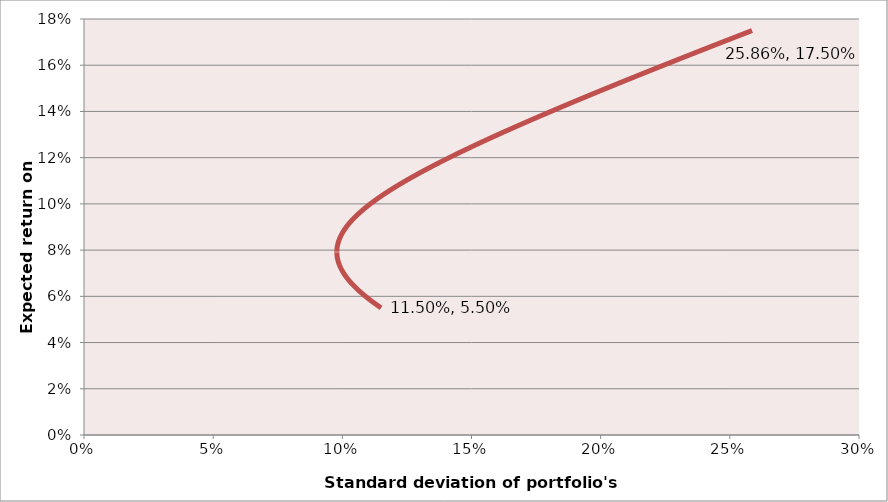
| Category | Ret(p) |
|---|---|
| 0.115 | 0.055 |
| 0.11484289846794242 | 0.055 |
| 0.11468636516202031 | 0.055 |
| 0.11453040241208622 | 0.055 |
| 0.11437501255218531 | 0.055 |
| 0.11422019792046717 | 0.056 |
| 0.1140659608590961 | 0.056 |
| 0.11391230371415985 | 0.056 |
| 0.11375922883557692 | 0.056 |
| 0.11360673857700218 | 0.056 |
| 0.11345483529573114 | 0.056 |
| 0.1133035213526025 | 0.056 |
| 0.11315279911189922 | 0.056 |
| 0.11300267094124809 | 0.057 |
| 0.11285313921151761 | 0.057 |
| 0.11270420629671442 | 0.057 |
| 0.11255587457387796 | 0.057 |
| 0.11240814642297389 | 0.057 |
| 0.11226102422678555 | 0.057 |
| 0.11211451037080405 | 0.057 |
| 0.11196860724311673 | 0.057 |
| 0.11182331723429394 | 0.058 |
| 0.11167864273727429 | 0.058 |
| 0.11153458614724834 | 0.058 |
| 0.11139114986154051 | 0.058 |
| 0.11124833627948959 | 0.058 |
| 0.11110614780232742 | 0.058 |
| 0.11096458683305613 | 0.058 |
| 0.11082365577632369 | 0.058 |
| 0.11068335703829786 | 0.058 |
| 0.11054369302653842 | 0.059 |
| 0.11040466614986798 | 0.059 |
| 0.11026627881824093 | 0.059 |
| 0.11012853344261105 | 0.059 |
| 0.1099914324347972 | 0.059 |
| 0.10985497820734759 | 0.059 |
| 0.10971917317340245 | 0.059 |
| 0.10958401974655493 | 0.059 |
| 0.10944952034071055 | 0.06 |
| 0.10931567736994491 | 0.06 |
| 0.10918249324835992 | 0.06 |
| 0.10904997038993841 | 0.06 |
| 0.10891811120839695 | 0.06 |
| 0.10878691811703747 | 0.06 |
| 0.10865639352859686 | 0.06 |
| 0.10852653985509536 | 0.06 |
| 0.10839735950768313 | 0.061 |
| 0.10826885489648537 | 0.061 |
| 0.10814102843044592 | 0.061 |
| 0.10801388251716916 | 0.061 |
| 0.1078874195627606 | 0.061 |
| 0.10776164197166566 | 0.061 |
| 0.10763655214650726 | 0.061 |
| 0.10751215248792158 | 0.061 |
| 0.10738844539439256 | 0.061 |
| 0.10726543326208479 | 0.062 |
| 0.10714311848467499 | 0.062 |
| 0.107021503453182 | 0.062 |
| 0.10690059055579527 | 0.062 |
| 0.10678038217770218 | 0.062 |
| 0.10666088070091342 | 0.062 |
| 0.10654208850408764 | 0.062 |
| 0.10642400796235406 | 0.062 |
| 0.10630664144713428 | 0.063 |
| 0.10618999132596221 | 0.063 |
| 0.10607405996230325 | 0.063 |
| 0.10595884971537146 | 0.063 |
| 0.10584436293994619 | 0.063 |
| 0.10573060198618674 | 0.063 |
| 0.10561756919944629 | 0.063 |
| 0.10550526692008419 | 0.063 |
| 0.10539369748327745 | 0.064 |
| 0.10528286321883064 | 0.064 |
| 0.10517276645098485 | 0.064 |
| 0.10506340949822543 | 0.064 |
| 0.10495479467308873 | 0.064 |
| 0.1048469242819675 | 0.064 |
| 0.10473980062491546 | 0.064 |
| 0.10463342599545071 | 0.064 |
| 0.10452780268035813 | 0.064 |
| 0.1044229329594908 | 0.065 |
| 0.1043188191055705 | 0.065 |
| 0.1042154633839872 | 0.065 |
| 0.10411286805259767 | 0.065 |
| 0.10401103536152331 | 0.065 |
| 0.10390996755294701 | 0.065 |
| 0.1038096668609092 | 0.065 |
| 0.10371013551110327 | 0.065 |
| 0.10361137572067007 | 0.066 |
| 0.10351338969799181 | 0.066 |
| 0.10341617964248527 | 0.066 |
| 0.1033197477443942 | 0.066 |
| 0.10322409618458146 | 0.066 |
| 0.10312922713432017 | 0.066 |
| 0.10303514275508466 | 0.066 |
| 0.10294184519834079 | 0.066 |
| 0.1028493366053357 | 0.067 |
| 0.10275761910688733 | 0.067 |
| 0.10266669482317345 | 0.067 |
| 0.10257656586352035 | 0.067 |
| 0.10248723432619124 | 0.067 |
| 0.10239870229817434 | 0.067 |
| 0.10231097185497087 | 0.067 |
| 0.10222404506038273 | 0.067 |
| 0.10213792396629996 | 0.067 |
| 0.10205261061248845 | 0.068 |
| 0.10196810702637721 | 0.068 |
| 0.10188441522284576 | 0.068 |
| 0.10180153720401168 | 0.068 |
| 0.1017194749590181 | 0.068 |
| 0.10163823046382128 | 0.068 |
| 0.10155780568097852 | 0.068 |
| 0.10147820255943607 | 0.068 |
| 0.10139942303431755 | 0.069 |
| 0.10132146902671242 | 0.069 |
| 0.10124434244346496 | 0.069 |
| 0.10116804517696366 | 0.069 |
| 0.10109257910493097 | 0.069 |
| 0.10101794609021357 | 0.069 |
| 0.10094414798057323 | 0.069 |
| 0.10087118660847827 | 0.069 |
| 0.10079906379089552 | 0.07 |
| 0.10072778132908324 | 0.07 |
| 0.10065734100838446 | 0.07 |
| 0.10058774459802142 | 0.07 |
| 0.10051899385089061 | 0.07 |
| 0.10045109050335879 | 0.07 |
| 0.1003840362750601 | 0.07 |
| 0.10031783286869383 | 0.07 |
| 0.10025248196982357 | 0.07 |
| 0.10018798524667723 | 0.071 |
| 0.10012434434994834 | 0.071 |
| 0.10006156091259845 | 0.071 |
| 0.0999996365496609 | 0.071 |
| 0.09993857285804568 | 0.071 |
| 0.0998783714163459 | 0.071 |
| 0.09981903378464538 | 0.071 |
| 0.09976056150432802 | 0.071 |
| 0.09970295609788836 | 0.072 |
| 0.09964621906874392 | 0.072 |
| 0.09959035190104891 | 0.072 |
| 0.09953535605950989 | 0.072 |
| 0.09948123298920289 | 0.072 |
| 0.09942798411539244 | 0.072 |
| 0.0993756108433523 | 0.072 |
| 0.09932411455818807 | 0.072 |
| 0.09927349662466183 | 0.073 |
| 0.09922375838701847 | 0.073 |
| 0.09917490116881439 | 0.073 |
| 0.09912692627274783 | 0.073 |
| 0.09907983498049173 | 0.073 |
| 0.09903362855252838 | 0.073 |
| 0.09898830822798652 | 0.073 |
| 0.09894387522448048 | 0.073 |
| 0.09890033073795186 | 0.073 |
| 0.0988576759425133 | 0.074 |
| 0.09881591199029478 | 0.074 |
| 0.09877504001129232 | 0.074 |
| 0.09873506111321913 | 0.074 |
| 0.09869597638135934 | 0.074 |
| 0.09865778687842418 | 0.074 |
| 0.09862049364441092 | 0.074 |
| 0.09858409769646435 | 0.074 |
| 0.09854860002874098 | 0.075 |
| 0.09851400161227594 | 0.075 |
| 0.09848030339485278 | 0.075 |
| 0.09844750630087588 | 0.075 |
| 0.098415611231246 | 0.075 |
| 0.09838461906323827 | 0.075 |
| 0.0983545306503837 | 0.075 |
| 0.09832534682235314 | 0.075 |
| 0.0982970683848445 | 0.076 |
| 0.098269696119473 | 0.076 |
| 0.09824323078366438 | 0.076 |
| 0.09821767311055137 | 0.076 |
| 0.09819302380887301 | 0.076 |
| 0.09816928356287771 | 0.076 |
| 0.09814645303222873 | 0.076 |
| 0.09812453285191361 | 0.076 |
| 0.0981035236321564 | 0.076 |
| 0.0980834259583334 | 0.077 |
| 0.09806424039089211 | 0.077 |
| 0.09804596746527358 | 0.077 |
| 0.09802860769183808 | 0.077 |
| 0.09801216155579426 | 0.077 |
| 0.09799662951713152 | 0.077 |
| 0.09798201201055608 | 0.077 |
| 0.09796830944543027 | 0.077 |
| 0.09795552220571545 | 0.078 |
| 0.09794365064991832 | 0.078 |
| 0.09793269511104086 | 0.078 |
| 0.0979226558965336 | 0.078 |
| 0.09791353328825272 | 0.078 |
| 0.09790532754242039 | 0.078 |
| 0.09789803888958898 | 0.078 |
| 0.09789166753460854 | 0.078 |
| 0.09788621365659822 | 0.079 |
| 0.0978816774089209 | 0.079 |
| 0.09787805891916189 | 0.079 |
| 0.09787535828911073 | 0.079 |
| 0.0978735755947471 | 0.079 |
| 0.09787271088622994 | 0.079 |
| 0.09787276418789059 | 0.079 |
| 0.09787373549822916 | 0.079 |
| 0.09787562478991495 | 0.079 |
| 0.09787843200979013 | 0.08 |
| 0.09788215707887729 | 0.08 |
| 0.09788679989239055 | 0.08 |
| 0.09789236031975025 | 0.08 |
| 0.09789883820460141 | 0.08 |
| 0.09790623336483553 | 0.08 |
| 0.09791454559261638 | 0.08 |
| 0.09792377465440899 | 0.08 |
| 0.09793392029101254 | 0.081 |
| 0.09794498221759665 | 0.081 |
| 0.09795696012374136 | 0.081 |
| 0.09796985367348057 | 0.081 |
| 0.09798366250534898 | 0.081 |
| 0.0979983862324328 | 0.081 |
| 0.09801402444242366 | 0.081 |
| 0.09803057669767617 | 0.081 |
| 0.09804804253526905 | 0.082 |
| 0.09806642146706937 | 0.082 |
| 0.09808571297980072 | 0.082 |
| 0.09810591653511429 | 0.082 |
| 0.09812703156966372 | 0.082 |
| 0.09814905749518309 | 0.082 |
| 0.09817199369856829 | 0.082 |
| 0.09819583954196183 | 0.082 |
| 0.0982205943628407 | 0.082 |
| 0.0982462574741078 | 0.083 |
| 0.09827282816418623 | 0.083 |
| 0.09830030569711709 | 0.083 |
| 0.09832868931266027 | 0.083 |
| 0.09835797822639845 | 0.083 |
| 0.0983881716298442 | 0.083 |
| 0.09841926869055007 | 0.083 |
| 0.09845126855222182 | 0.083 |
| 0.09848417033483463 | 0.084 |
| 0.09851797313475212 | 0.084 |
| 0.0985526760248486 | 0.084 |
| 0.09858827805463384 | 0.084 |
| 0.09862477825038102 | 0.084 |
| 0.09866217561525727 | 0.084 |
| 0.09870046912945706 | 0.084 |
| 0.09873965775033833 | 0.084 |
| 0.09877974041256131 | 0.085 |
| 0.09882071602822988 | 0.085 |
| 0.0988625834870357 | 0.085 |
| 0.0989053416564048 | 0.085 |
| 0.09894898938164667 | 0.085 |
| 0.09899352548610588 | 0.085 |
| 0.09903894877131605 | 0.085 |
| 0.0990852580171563 | 0.085 |
| 0.09913245198200998 | 0.085 |
| 0.09918052940292563 | 0.086 |
| 0.0992294889957803 | 0.086 |
| 0.09927932945544492 | 0.086 |
| 0.09933004945595196 | 0.086 |
| 0.09938164765066515 | 0.086 |
| 0.09943412267245114 | 0.086 |
| 0.09948747313385321 | 0.086 |
| 0.0995416976272671 | 0.086 |
| 0.09959679472511845 | 0.087 |
| 0.09965276298004233 | 0.087 |
| 0.09970960092506446 | 0.087 |
| 0.09976730707378414 | 0.087 |
| 0.099825879920559 | 0.087 |
| 0.09988531794069135 | 0.087 |
| 0.09994561959061601 | 0.087 |
| 0.10000678330809 | 0.087 |
| 0.10006880751238324 | 0.088 |
| 0.10013169060447125 | 0.088 |
| 0.10019543096722874 | 0.088 |
| 0.10026002696562501 | 0.088 |
| 0.10032547694692016 | 0.088 |
| 0.10039177924086301 | 0.088 |
| 0.10045893215988977 | 0.088 |
| 0.1005269339993243 | 0.088 |
| 0.10059578303757905 | 0.088 |
| 0.10066547753635727 | 0.089 |
| 0.1007360157408562 | 0.089 |
| 0.10080739587997108 | 0.089 |
| 0.10087961616650014 | 0.089 |
| 0.10095267479735039 | 0.089 |
| 0.10102656995374425 | 0.089 |
| 0.10110129980142675 | 0.089 |
| 0.10117686249087375 | 0.089 |
| 0.10125325615750035 | 0.09 |
| 0.10133047892187026 | 0.09 |
| 0.10140852888990552 | 0.09 |
| 0.10148740415309686 | 0.09 |
| 0.10156710278871421 | 0.09 |
| 0.10164762286001806 | 0.09 |
| 0.1017289624164706 | 0.09 |
| 0.10181111949394783 | 0.09 |
| 0.10189409211495118 | 0.091 |
| 0.10197787828882006 | 0.091 |
| 0.10206247601194396 | 0.091 |
| 0.10214788326797518 | 0.091 |
| 0.10223409802804118 | 0.091 |
| 0.1023211182509573 | 0.091 |
| 0.10240894188343928 | 0.091 |
| 0.10249756686031579 | 0.091 |
| 0.1025869911047408 | 0.091 |
| 0.10267721252840593 | 0.092 |
| 0.10276822903175237 | 0.092 |
| 0.10286003850418289 | 0.092 |
| 0.1029526388242733 | 0.092 |
| 0.10304602785998376 | 0.092 |
| 0.10314020346886967 | 0.092 |
| 0.10323516349829223 | 0.092 |
| 0.10333090578562844 | 0.092 |
| 0.10342742815848087 | 0.093 |
| 0.10352472843488662 | 0.093 |
| 0.10362280442352605 | 0.093 |
| 0.10372165392393065 | 0.093 |
| 0.10382127472669055 | 0.093 |
| 0.10392166461366113 | 0.093 |
| 0.10402282135816925 | 0.093 |
| 0.10412474272521836 | 0.093 |
| 0.10422742647169336 | 0.094 |
| 0.10433087034656414 | 0.094 |
| 0.10443507209108878 | 0.094 |
| 0.10454002943901561 | 0.094 |
| 0.10464574011678447 | 0.094 |
| 0.10475220184372709 | 0.094 |
| 0.10485941233226655 | 0.094 |
| 0.10496736928811566 | 0.094 |
| 0.10507607041047456 | 0.094 |
| 0.10518551339222701 | 0.095 |
| 0.10529569592013595 | 0.095 |
| 0.10540661567503769 | 0.095 |
| 0.10551827033203529 | 0.095 |
| 0.10563065756069047 | 0.095 |
| 0.10574377502521477 | 0.095 |
| 0.10585762038465922 | 0.095 |
| 0.10597219129310297 | 0.095 |
| 0.10608748539984063 | 0.096 |
| 0.10620350034956849 | 0.096 |
| 0.1063202337825693 | 0.096 |
| 0.106437683334896 | 0.096 |
| 0.10655584663855382 | 0.096 |
| 0.10667472132168153 | 0.096 |
| 0.10679430500873081 | 0.096 |
| 0.10691459532064482 | 0.096 |
| 0.10703558987503488 | 0.097 |
| 0.10715728628635617 | 0.097 |
| 0.10727968216608177 | 0.097 |
| 0.10740277512287547 | 0.097 |
| 0.10752656276276293 | 0.097 |
| 0.10765104268930159 | 0.097 |
| 0.10777621250374907 | 0.097 |
| 0.10790206980523 | 0.097 |
| 0.10802861219090143 | 0.097 |
| 0.10815583725611687 | 0.098 |
| 0.10828374259458846 | 0.098 |
| 0.10841232579854819 | 0.098 |
| 0.10854158445890692 | 0.098 |
| 0.10867151616541243 | 0.098 |
| 0.10880211850680559 | 0.098 |
| 0.10893338907097515 | 0.098 |
| 0.10906532544511079 | 0.098 |
| 0.10919792521585478 | 0.099 |
| 0.10933118596945203 | 0.099 |
| 0.10946510529189836 | 0.099 |
| 0.10959968076908752 | 0.099 |
| 0.10973490998695626 | 0.099 |
| 0.1098707905316281 | 0.099 |
| 0.11000731998955526 | 0.099 |
| 0.11014449594765922 | 0.099 |
| 0.11028231599346938 | 0.1 |
| 0.11042077771526043 | 0.1 |
| 0.11055987870218778 | 0.1 |
| 0.1106996165444217 | 0.1 |
| 0.11083998883327954 | 0.1 |
| 0.11098099316135654 | 0.1 |
| 0.11112262712265492 | 0.1 |
| 0.11126488831271143 | 0.1 |
| 0.11140777432872309 | 0.1 |
| 0.11155128276967163 | 0.101 |
| 0.11169541123644604 | 0.101 |
| 0.11184015733196351 | 0.101 |
| 0.11198551866128903 | 0.101 |
| 0.112131492831753 | 0.101 |
| 0.11227807745306757 | 0.101 |
| 0.11242527013744114 | 0.101 |
| 0.1125730684996913 | 0.101 |
| 0.11272147015735631 | 0.102 |
| 0.11287047273080482 | 0.102 |
| 0.11302007384334405 | 0.102 |
| 0.11317027112132644 | 0.102 |
| 0.11332106219425463 | 0.102 |
| 0.11347244469488493 | 0.102 |
| 0.11362441625932924 | 0.102 |
| 0.11377697452715523 | 0.102 |
| 0.11393011714148518 | 0.103 |
| 0.11408384174909324 | 0.103 |
| 0.11423814600050093 | 0.103 |
| 0.11439302755007136 | 0.103 |
| 0.11454848405610182 | 0.103 |
| 0.11470451318091472 | 0.103 |
| 0.11486111259094729 | 0.103 |
| 0.1150182799568395 | 0.103 |
| 0.1151760129535206 | 0.103 |
| 0.11533430926029421 | 0.104 |
| 0.11549316656092183 | 0.104 |
| 0.11565258254370493 | 0.104 |
| 0.11581255490156556 | 0.104 |
| 0.11597308133212549 | 0.104 |
| 0.11613415953778396 | 0.104 |
| 0.11629578722579387 | 0.104 |
| 0.11645796210833671 | 0.104 |
| 0.1166206819025959 | 0.105 |
| 0.11678394433082888 | 0.105 |
| 0.11694774712043758 | 0.105 |
| 0.11711208800403783 | 0.105 |
| 0.11727696471952703 | 0.105 |
| 0.11744237501015076 | 0.105 |
| 0.11760831662456774 | 0.105 |
| 0.11777478731691376 | 0.105 |
| 0.11794178484686407 | 0.106 |
| 0.11810930697969438 | 0.106 |
| 0.11827735148634075 | 0.106 |
| 0.1184459161434581 | 0.106 |
| 0.1186149987334773 | 0.106 |
| 0.11878459704466125 | 0.106 |
| 0.11895470887115932 | 0.106 |
| 0.11912533201306094 | 0.106 |
| 0.11929646427644758 | 0.106 |
| 0.11946810347344378 | 0.107 |
| 0.11964024742226675 | 0.107 |
| 0.11981289394727494 | 0.107 |
| 0.11998604087901517 | 0.107 |
| 0.12015968605426884 | 0.107 |
| 0.1203338273160968 | 0.107 |
| 0.12050846251388309 | 0.107 |
| 0.1206835895033775 | 0.107 |
| 0.12085920614673709 | 0.108 |
| 0.12103531031256648 | 0.108 |
| 0.12121189987595705 | 0.108 |
| 0.12138897271852503 | 0.108 |
| 0.12156652672844855 | 0.108 |
| 0.12174455980050353 | 0.108 |
| 0.12192306983609857 | 0.108 |
| 0.12210205474330872 | 0.108 |
| 0.12228151243690831 | 0.109 |
| 0.1224614408384025 | 0.109 |
| 0.12264183787605829 | 0.109 |
| 0.12282270148493384 | 0.109 |
| 0.12300402960690751 | 0.109 |
| 0.12318582019070537 | 0.109 |
| 0.123368071191928 | 0.109 |
| 0.12355078057307625 | 0.109 |
| 0.12373394630357613 | 0.109 |
| 0.12391756635980264 | 0.11 |
| 0.12410163872510277 | 0.11 |
| 0.12428616138981749 | 0.11 |
| 0.12447113235130305 | 0.11 |
| 0.12465654961395108 | 0.11 |
| 0.12484241118920802 | 0.11 |
| 0.12502871509559374 | 0.11 |
| 0.125215459358719 | 0.11 |
| 0.1254026420113024 | 0.111 |
| 0.12559026109318638 | 0.111 |
| 0.12577831465135234 | 0.111 |
| 0.1259668007399349 | 0.111 |
| 0.12615571742023562 | 0.111 |
| 0.12634506276073562 | 0.111 |
| 0.1265348348371076 | 0.111 |
| 0.12672503173222716 | 0.111 |
| 0.12691565153618317 | 0.112 |
| 0.12710669234628744 | 0.112 |
| 0.12729815226708385 | 0.112 |
| 0.1274900294103565 | 0.112 |
| 0.12768232189513734 | 0.112 |
| 0.127875027847713 | 0.112 |
| 0.12806814540163097 | 0.112 |
| 0.128261672697705 | 0.112 |
| 0.1284556078840201 | 0.112 |
| 0.1286499491159365 | 0.113 |
| 0.1288446945560933 | 0.113 |
| 0.12903984237441127 | 0.113 |
| 0.12923539074809517 | 0.113 |
| 0.12943133786163527 | 0.113 |
| 0.12962768190680848 | 0.113 |
| 0.1298244210826787 | 0.113 |
| 0.13002155359559667 | 0.113 |
| 0.13021907765919927 | 0.114 |
| 0.13041699149440816 | 0.114 |
| 0.1306152933294279 | 0.114 |
| 0.13081398139974357 | 0.114 |
| 0.1310130539481178 | 0.114 |
| 0.13121250922458724 | 0.114 |
| 0.13141234548645866 | 0.114 |
| 0.1316125609983042 | 0.114 |
| 0.13181315403195665 | 0.115 |
| 0.13201412286650363 | 0.115 |
| 0.13221546578828178 | 0.115 |
| 0.13241718109087017 | 0.115 |
| 0.13261926707508342 | 0.115 |
| 0.1328217220489642 | 0.115 |
| 0.1330245443277755 | 0.115 |
| 0.13322773223399217 | 0.115 |
| 0.13343128409729232 | 0.115 |
| 0.133635198254548 | 0.116 |
| 0.13383947304981578 | 0.116 |
| 0.13404410683432672 | 0.116 |
| 0.13424909796647583 | 0.116 |
| 0.13445444481181146 | 0.116 |
| 0.1346601457430241 | 0.116 |
| 0.1348661991399347 | 0.116 |
| 0.135072603389483 | 0.116 |
| 0.13527935688571488 | 0.117 |
| 0.13548645802977013 | 0.117 |
| 0.13569390522986918 | 0.117 |
| 0.13590169690129988 | 0.117 |
| 0.1361098314664038 | 0.117 |
| 0.13631830735456227 | 0.117 |
| 0.13652712300218217 | 0.117 |
| 0.13673627685268108 | 0.117 |
| 0.13694576735647265 | 0.118 |
| 0.1371555929709511 | 0.118 |
| 0.13736575216047592 | 0.118 |
| 0.13757624339635596 | 0.118 |
| 0.13778706515683345 | 0.118 |
| 0.13799821592706757 | 0.118 |
| 0.13820969419911786 | 0.118 |
| 0.1384214984719273 | 0.118 |
| 0.13863362725130537 | 0.118 |
| 0.13884607904991048 | 0.119 |
| 0.13905885238723245 | 0.119 |
| 0.13927194578957464 | 0.119 |
| 0.13948535779003593 | 0.119 |
| 0.13969908692849237 | 0.119 |
| 0.1399131317515786 | 0.119 |
| 0.14012749081266934 | 0.119 |
| 0.14034216267186017 | 0.119 |
| 0.1405571458959487 | 0.12 |
| 0.14077243905841494 | 0.12 |
| 0.14098804073940208 | 0.12 |
| 0.1412039495256965 | 0.12 |
| 0.1414201640107082 | 0.12 |
| 0.1416366827944504 | 0.12 |
| 0.14185350448351963 | 0.12 |
| 0.14207062769107515 | 0.12 |
| 0.1422880510368185 | 0.121 |
| 0.1425057731469727 | 0.121 |
| 0.14272379265426147 | 0.121 |
| 0.14294210819788827 | 0.121 |
| 0.1431607184235151 | 0.121 |
| 0.14337962198324128 | 0.121 |
| 0.14359881753558196 | 0.121 |
| 0.14381830374544669 | 0.121 |
| 0.14403807928411766 | 0.121 |
| 0.14425814282922805 | 0.122 |
| 0.14447849306474017 | 0.122 |
| 0.14469912868092324 | 0.122 |
| 0.14492004837433156 | 0.122 |
| 0.14514125084778212 | 0.122 |
| 0.14536273481033246 | 0.122 |
| 0.14558449897725811 | 0.122 |
| 0.14580654207003024 | 0.122 |
| 0.14602886281629301 | 0.123 |
| 0.14625145994984104 | 0.123 |
| 0.14647433221059655 | 0.123 |
| 0.14669747834458657 | 0.123 |
| 0.14692089710392017 | 0.123 |
| 0.14714458724676538 | 0.123 |
| 0.1473685475373263 | 0.123 |
| 0.14759277674582 | 0.123 |
| 0.14781727364845332 | 0.124 |
| 0.14804203702739974 | 0.124 |
| 0.14826706567077622 | 0.124 |
| 0.1484923583726198 | 0.124 |
| 0.14871791393286427 | 0.124 |
| 0.14894373115731693 | 0.124 |
| 0.1491698088576351 | 0.124 |
| 0.1493961458513026 | 0.124 |
| 0.14962274096160644 | 0.124 |
| 0.14984959301761308 | 0.125 |
| 0.15007670085414515 | 0.125 |
| 0.15030406331175775 | 0.125 |
| 0.1505316792367148 | 0.125 |
| 0.1507595474809655 | 0.125 |
| 0.1509876669021209 | 0.125 |
| 0.15121603636342987 | 0.125 |
| 0.15144465473375565 | 0.125 |
| 0.15167352088755237 | 0.126 |
| 0.15190263370484106 | 0.126 |
| 0.15213199207118616 | 0.126 |
| 0.1523615948776718 | 0.126 |
| 0.15259144102087815 | 0.126 |
| 0.15282152940285765 | 0.126 |
| 0.15305185893111142 | 0.126 |
| 0.15328242851856566 | 0.126 |
| 0.15351323708354775 | 0.127 |
| 0.15374428354976294 | 0.127 |
| 0.15397556684627034 | 0.127 |
| 0.15420708590745963 | 0.127 |
| 0.15443883967302724 | 0.127 |
| 0.1546708270879528 | 0.127 |
| 0.15490304710247557 | 0.127 |
| 0.15513549867207102 | 0.127 |
| 0.1553681807574271 | 0.127 |
| 0.1556010923244208 | 0.128 |
| 0.1558342323440948 | 0.128 |
| 0.15606759979263382 | 0.128 |
| 0.1563011936513414 | 0.128 |
| 0.15653501290661628 | 0.128 |
| 0.15676905654992934 | 0.128 |
| 0.15700332357779995 | 0.128 |
| 0.15723781299177297 | 0.128 |
| 0.15747252379839535 | 0.129 |
| 0.15770745500919295 | 0.129 |
| 0.15794260564064733 | 0.129 |
| 0.15817797471417278 | 0.129 |
| 0.15841356125609296 | 0.129 |
| 0.15864936429761814 | 0.129 |
| 0.15888538287482204 | 0.129 |
| 0.15912161602861893 | 0.129 |
| 0.15935806280474074 | 0.13 |
| 0.1595947222537141 | 0.13 |
| 0.15983159343083772 | 0.13 |
| 0.16006867539615946 | 0.13 |
| 0.16030596721445378 | 0.13 |
| 0.16054346795519897 | 0.13 |
| 0.16078117669255465 | 0.13 |
| 0.1610190925053391 | 0.13 |
| 0.161257214477007 | 0.13 |
| 0.16149554169562674 | 0.131 |
| 0.1617340732538583 | 0.131 |
| 0.1619728082489308 | 0.131 |
| 0.16221174578262018 | 0.131 |
| 0.16245088496122728 | 0.131 |
| 0.1626902248955554 | 0.131 |
| 0.16292976470088855 | 0.131 |
| 0.1631695034969691 | 0.131 |
| 0.16340944040797623 | 0.132 |
| 0.16364957456250367 | 0.132 |
| 0.16388990509353824 | 0.132 |
| 0.16413043113843787 | 0.132 |
| 0.16437115183891007 | 0.132 |
| 0.16461206634099018 | 0.132 |
| 0.1648531737950201 | 0.132 |
| 0.1650944733556264 | 0.132 |
| 0.16533596418169938 | 0.133 |
| 0.1655776454363714 | 0.133 |
| 0.16581951628699584 | 0.133 |
| 0.16606157590512574 | 0.133 |
| 0.16630382346649278 | 0.133 |
| 0.16654625815098628 | 0.133 |
| 0.16678887914263207 | 0.133 |
| 0.1670316856295718 | 0.133 |
| 0.1672746768040419 | 0.133 |
| 0.16751785186235302 | 0.134 |
| 0.1677612100048692 | 0.134 |
| 0.16800475043598745 | 0.134 |
| 0.1682484723641169 | 0.134 |
| 0.16849237500165876 | 0.134 |
| 0.16873645756498562 | 0.134 |
| 0.16898071927442138 | 0.134 |
| 0.169225159354221 | 0.134 |
| 0.16946977703254965 | 0.135 |
| 0.16971457154146402 | 0.135 |
| 0.1699595421168912 | 0.135 |
| 0.17020468799860933 | 0.135 |
| 0.1704500084302273 | 0.135 |
| 0.17069550265916553 | 0.135 |
| 0.17094116993663586 | 0.135 |
| 0.17118700951762217 | 0.135 |
| 0.17143302066086072 | 0.136 |
| 0.17167920262882086 | 0.136 |
| 0.1719255546876856 | 0.136 |
| 0.17217207610733232 | 0.136 |
| 0.17241876616131344 | 0.136 |
| 0.17266562412683756 | 0.136 |
| 0.17291264928475014 | 0.136 |
| 0.17315984091951478 | 0.136 |
| 0.17340719831919418 | 0.136 |
| 0.1736547207754313 | 0.137 |
| 0.17390240758343078 | 0.137 |
| 0.1741502580419402 | 0.137 |
| 0.17439827145323156 | 0.137 |
| 0.17464644712308272 | 0.137 |
| 0.1748947843607591 | 0.137 |
| 0.17514328247899524 | 0.137 |
| 0.17539194079397666 | 0.137 |
| 0.1756407586253217 | 0.138 |
| 0.17588973529606328 | 0.138 |
| 0.17613887013263121 | 0.138 |
| 0.17638816246483388 | 0.138 |
| 0.17663761162584074 | 0.138 |
| 0.1768872169521644 | 0.138 |
| 0.1771369777836429 | 0.138 |
| 0.17738689346342226 | 0.138 |
| 0.17763696333793894 | 0.139 |
| 0.17788718675690215 | 0.139 |
| 0.17813756307327697 | 0.139 |
| 0.1783880916432666 | 0.139 |
| 0.17863877182629534 | 0.139 |
| 0.17888960298499176 | 0.139 |
| 0.17914058448517112 | 0.139 |
| 0.17939171569581877 | 0.139 |
| 0.1796429959890734 | 0.139 |
| 0.1798944247402098 | 0.14 |
| 0.18014600132762254 | 0.14 |
| 0.18039772513280913 | 0.14 |
| 0.18064959554035354 | 0.14 |
| 0.18090161193790982 | 0.14 |
| 0.18115377371618538 | 0.14 |
| 0.18140608026892505 | 0.14 |
| 0.18165853099289467 | 0.14 |
| 0.18191112528786488 | 0.141 |
| 0.18216386255659509 | 0.141 |
| 0.18241674220481757 | 0.141 |
| 0.18266976364122134 | 0.141 |
| 0.18292292627743653 | 0.141 |
| 0.18317622952801846 | 0.141 |
| 0.18342967281043196 | 0.141 |
| 0.18368325554503584 | 0.141 |
| 0.18393697715506735 | 0.142 |
| 0.18419083706662662 | 0.142 |
| 0.1844448347086614 | 0.142 |
| 0.1846989695129517 | 0.142 |
| 0.18495324091409457 | 0.142 |
| 0.18520764834948894 | 0.142 |
| 0.18546219125932056 | 0.142 |
| 0.18571686908654703 | 0.142 |
| 0.18597168127688285 | 0.142 |
| 0.1862266272787846 | 0.143 |
| 0.1864817065434361 | 0.143 |
| 0.18673691852473387 | 0.143 |
| 0.18699226267927227 | 0.143 |
| 0.18724773846632925 | 0.143 |
| 0.18750334534785162 | 0.143 |
| 0.18775908278844086 | 0.143 |
| 0.18801495025533868 | 0.143 |
| 0.18827094721841275 | 0.144 |
| 0.1885270731501427 | 0.144 |
| 0.1887833275256058 | 0.144 |
| 0.18903970982246313 | 0.144 |
| 0.18929621952094544 | 0.144 |
| 0.18955285610383946 | 0.144 |
| 0.189809619056474 | 0.144 |
| 0.1900665078667062 | 0.144 |
| 0.19032352202490793 | 0.145 |
| 0.1905806610239521 | 0.145 |
| 0.19083792435919927 | 0.145 |
| 0.19109531152848414 | 0.145 |
| 0.19135282203210208 | 0.145 |
| 0.19161045537279603 | 0.145 |
| 0.1918682110557432 | 0.145 |
| 0.19212608858854166 | 0.145 |
| 0.1923840874811976 | 0.145 |
| 0.19264220724611222 | 0.146 |
| 0.19290044739806855 | 0.146 |
| 0.19315880745421876 | 0.146 |
| 0.19341728693407145 | 0.146 |
| 0.1936758853594786 | 0.146 |
| 0.1939346022546231 | 0.146 |
| 0.19419343714600618 | 0.146 |
| 0.19445238956243457 | 0.146 |
| 0.19471145903500853 | 0.147 |
| 0.1949706450971089 | 0.147 |
| 0.19522994728438509 | 0.147 |
| 0.19548936513474277 | 0.147 |
| 0.1957488981883315 | 0.147 |
| 0.19600854598753284 | 0.147 |
| 0.19626830807694803 | 0.147 |
| 0.19652818400338612 | 0.147 |
| 0.196788173315852 | 0.148 |
| 0.19704827556553448 | 0.148 |
| 0.1973084903057946 | 0.148 |
| 0.19756881709215363 | 0.148 |
| 0.1978292554822817 | 0.148 |
| 0.19808980503598594 | 0.148 |
| 0.19835046531519898 | 0.148 |
| 0.19861123588396754 | 0.148 |
| 0.19887211630844087 | 0.148 |
| 0.19913310615685953 | 0.149 |
| 0.19939420499954388 | 0.149 |
| 0.19965541240888307 | 0.149 |
| 0.1999167279593237 | 0.149 |
| 0.20017815122735874 | 0.149 |
| 0.20043968179151642 | 0.149 |
| 0.2007013192323494 | 0.149 |
| 0.20096306313242368 | 0.149 |
| 0.2012249130763077 | 0.15 |
| 0.20148686865056162 | 0.15 |
| 0.20174892944372652 | 0.15 |
| 0.20201109504631382 | 0.15 |
| 0.20227336505079438 | 0.15 |
| 0.2025357390515882 | 0.15 |
| 0.20279821664505368 | 0.15 |
| 0.2030607974294773 | 0.15 |
| 0.20332348100506328 | 0.151 |
| 0.20358626697392299 | 0.151 |
| 0.20384915494006484 | 0.151 |
| 0.20411214450938403 | 0.151 |
| 0.2043752352896524 | 0.151 |
| 0.20463842689050832 | 0.151 |
| 0.20490171892344644 | 0.151 |
| 0.20516511100180793 | 0.151 |
| 0.20542860274077052 | 0.151 |
| 0.2056921937573384 | 0.152 |
| 0.20595588367033263 | 0.152 |
| 0.20621967210038122 | 0.152 |
| 0.20648355866990933 | 0.152 |
| 0.2067475430031299 | 0.152 |
| 0.2070116247260337 | 0.152 |
| 0.20727580346637994 | 0.152 |
| 0.20754007885368678 | 0.152 |
| 0.2078044505192218 | 0.153 |
| 0.20806891809599257 | 0.153 |
| 0.20833348121873746 | 0.153 |
| 0.20859813952391623 | 0.153 |
| 0.2088628926497007 | 0.153 |
| 0.2091277402359658 | 0.153 |
| 0.2093926819242802 | 0.153 |
| 0.20965771735789737 | 0.153 |
| 0.20992284618174642 | 0.154 |
| 0.21018806804242335 | 0.154 |
| 0.21045338258818172 | 0.154 |
| 0.2107187894689242 | 0.154 |
| 0.21098428833619345 | 0.154 |
| 0.21124987884316343 | 0.154 |
| 0.2115155606446307 | 0.154 |
| 0.2117813333970057 | 0.154 |
| 0.21204719675830402 | 0.154 |
| 0.2123131503881381 | 0.155 |
| 0.2125791939477083 | 0.155 |
| 0.21284532709979473 | 0.155 |
| 0.21311154950874872 | 0.155 |
| 0.21337786084048438 | 0.155 |
| 0.21364426076247023 | 0.155 |
| 0.21391074894372097 | 0.155 |
| 0.2141773250547893 | 0.155 |
| 0.21444398876775758 | 0.156 |
| 0.21471073975622973 | 0.156 |
| 0.2149775776953231 | 0.156 |
| 0.21524450226166045 | 0.156 |
| 0.21551151313336192 | 0.156 |
| 0.21577860999003706 | 0.156 |
| 0.21604579251277678 | 0.156 |
| 0.21631306038414577 | 0.156 |
| 0.2165804132881743 | 0.157 |
| 0.21684785091035066 | 0.157 |
| 0.21711537293761346 | 0.157 |
| 0.2173829790583437 | 0.157 |
| 0.21765066896235719 | 0.157 |
| 0.2179184423408971 | 0.157 |
| 0.2181862988866263 | 0.157 |
| 0.2184542382936196 | 0.157 |
| 0.21872226025735664 | 0.157 |
| 0.21899036447471423 | 0.158 |
| 0.21925855064395897 | 0.158 |
| 0.21952681846473984 | 0.158 |
| 0.21979516763808113 | 0.158 |
| 0.22006359786637483 | 0.158 |
| 0.2203321088533736 | 0.158 |
| 0.22060070030418358 | 0.158 |
| 0.22086937192525719 | 0.158 |
| 0.2211381234243859 | 0.159 |
| 0.22140695451069348 | 0.159 |
| 0.22167586489462865 | 0.159 |
| 0.22194485428795827 | 0.159 |
| 0.2222139224037603 | 0.159 |
| 0.22248306895641692 | 0.159 |
| 0.2227522936616078 | 0.159 |
| 0.22302159623630294 | 0.159 |
| 0.22329097639875625 | 0.16 |
| 0.22356043386849855 | 0.16 |
| 0.22382996836633093 | 0.16 |
| 0.22409957961431812 | 0.16 |
| 0.22436926733578177 | 0.16 |
| 0.2246390312552939 | 0.16 |
| 0.22490887109867036 | 0.16 |
| 0.22517878659296423 | 0.16 |
| 0.22544877746645944 | 0.16 |
| 0.2257188434486642 | 0.161 |
| 0.22598898427030462 | 0.161 |
| 0.22625919966331848 | 0.161 |
| 0.22652948936084866 | 0.161 |
| 0.226799853097237 | 0.161 |
| 0.22707029060801798 | 0.161 |
| 0.22734080162991238 | 0.161 |
| 0.22761138590082136 | 0.161 |
| 0.22788204315982 | 0.162 |
| 0.22815277314715138 | 0.162 |
| 0.22842357560422036 | 0.162 |
| 0.22869445027358762 | 0.162 |
| 0.22896539689896353 | 0.162 |
| 0.22923641522520233 | 0.162 |
| 0.22950750499829595 | 0.162 |
| 0.22977866596536833 | 0.162 |
| 0.23004989787466937 | 0.163 |
| 0.2303212004755691 | 0.163 |
| 0.23059257351855192 | 0.163 |
| 0.23086401675521082 | 0.163 |
| 0.23113552993824155 | 0.163 |
| 0.23140711282143697 | 0.163 |
| 0.2316787651596813 | 0.163 |
| 0.23195048670894455 | 0.163 |
| 0.23222227722627686 | 0.163 |
| 0.23249413646980283 | 0.164 |
| 0.2327660641987161 | 0.164 |
| 0.2330380601732737 | 0.164 |
| 0.23331012415479072 | 0.164 |
| 0.23358225590563464 | 0.164 |
| 0.23385445518922002 | 0.164 |
| 0.23412672177000313 | 0.164 |
| 0.23439905541347644 | 0.164 |
| 0.2346714558861634 | 0.165 |
| 0.23494392295561314 | 0.165 |
| 0.2352164563903951 | 0.165 |
| 0.2354890559600938 | 0.165 |
| 0.23576172143530372 | 0.165 |
| 0.23603445258762398 | 0.165 |
| 0.23630724918965323 | 0.165 |
| 0.2365801110149846 | 0.165 |
| 0.23685303783820047 | 0.166 |
| 0.23712602943486738 | 0.166 |
| 0.2373990855815312 | 0.166 |
| 0.23767220605571188 | 0.166 |
| 0.23794539063589853 | 0.166 |
| 0.2382186391015446 | 0.166 |
| 0.23849195123306266 | 0.166 |
| 0.23876532681181983 | 0.166 |
| 0.2390387656201327 | 0.166 |
| 0.23931226744126252 | 0.167 |
| 0.23958583205941034 | 0.167 |
| 0.23985945925971228 | 0.167 |
| 0.24013314882823486 | 0.167 |
| 0.24040690055197006 | 0.167 |
| 0.2406807142188307 | 0.167 |
| 0.24095458961764574 | 0.167 |
| 0.24122852653815574 | 0.167 |
| 0.24150252477100803 | 0.168 |
| 0.24177658410775218 | 0.168 |
| 0.24205070434083562 | 0.168 |
| 0.24232488526359866 | 0.168 |
| 0.24259912667027045 | 0.168 |
| 0.242873428355964 | 0.168 |
| 0.24314779011667212 | 0.168 |
| 0.24342221174926273 | 0.168 |
| 0.24369669305147446 | 0.169 |
| 0.24397123382191235 | 0.169 |
| 0.24424583386004337 | 0.169 |
| 0.24452049296619205 | 0.169 |
| 0.24479521094153633 | 0.169 |
| 0.245069987588103 | 0.169 |
| 0.2453448227087636 | 0.169 |
| 0.24561971610723016 | 0.169 |
| 0.24589466758805084 | 0.169 |
| 0.24616967695660597 | 0.17 |
| 0.2464447440191035 | 0.17 |
| 0.24671986858257514 | 0.17 |
| 0.2469950504548722 | 0.17 |
| 0.2472702894446613 | 0.17 |
| 0.24754558536142046 | 0.17 |
| 0.2478209380154349 | 0.17 |
| 0.24809634721779308 | 0.17 |
| 0.2483718127803827 | 0.171 |
| 0.2486473345158866 | 0.171 |
| 0.24892291223777885 | 0.171 |
| 0.24919854576032077 | 0.171 |
| 0.24947423489855708 | 0.171 |
| 0.24974997946831184 | 0.171 |
| 0.2500257792861847 | 0.171 |
| 0.2503016341695469 | 0.171 |
| 0.25057754393653764 | 0.172 |
| 0.25085350840606 | 0.172 |
| 0.25112952739777733 | 0.172 |
| 0.25140560073210927 | 0.172 |
| 0.2516817282302284 | 0.172 |
| 0.2519579097140558 | 0.172 |
| 0.25223414500625824 | 0.172 |
| 0.2525104339302435 | 0.172 |
| 0.2527867763101576 | 0.172 |
| 0.2530631719708806 | 0.173 |
| 0.2533396207380229 | 0.173 |
| 0.2536161224379221 | 0.173 |
| 0.25389267689763895 | 0.173 |
| 0.2541692839449541 | 0.173 |
| 0.25444594340836424 | 0.173 |
| 0.2547226551170789 | 0.173 |
| 0.25499941890101663 | 0.173 |
| 0.25527623459080157 | 0.174 |
| 0.25555310201776027 | 0.174 |
| 0.25583002101391783 | 0.174 |
| 0.25610699141199456 | 0.174 |
| 0.25638401304540287 | 0.174 |
| 0.25666108574824337 | 0.174 |
| 0.256938209355302 | 0.174 |
| 0.25721538370204616 | 0.174 |
| 0.25749260862462187 | 0.175 |
| 0.25776988395985 | 0.175 |
| 0.25804720954522337 | 0.175 |
| 0.258324585218903 | 0.175 |
| 0.258602010819715 | 0.175 |